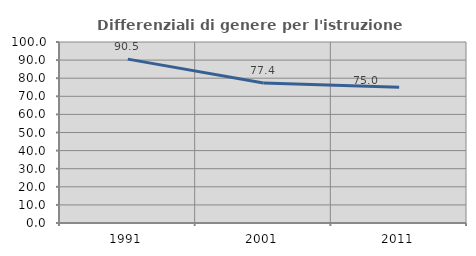
| Category | Differenziali di genere per l'istruzione superiore |
|---|---|
| 1991.0 | 90.531 |
| 2001.0 | 77.37 |
| 2011.0 | 74.978 |